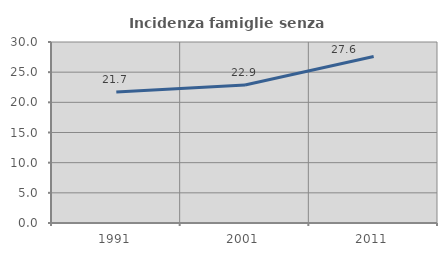
| Category | Incidenza famiglie senza nuclei |
|---|---|
| 1991.0 | 21.703 |
| 2001.0 | 22.864 |
| 2011.0 | 27.608 |